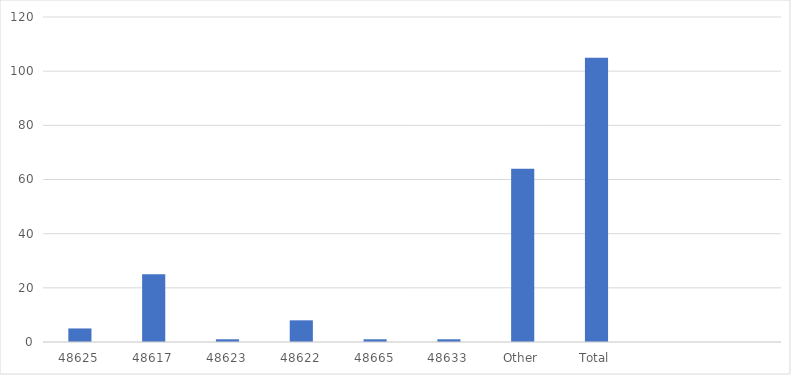
| Category | Number of Responses |
|---|---|
| 48625 | 5 |
| 48617 | 25 |
| 48623 | 1 |
| 48622 | 8 |
| 48665 | 1 |
| 48633 | 1 |
| Other | 64 |
| Total | 105 |